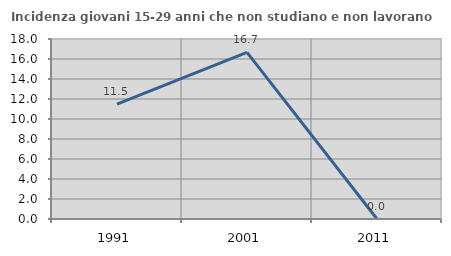
| Category | Incidenza giovani 15-29 anni che non studiano e non lavorano  |
|---|---|
| 1991.0 | 11.494 |
| 2001.0 | 16.667 |
| 2011.0 | 0 |